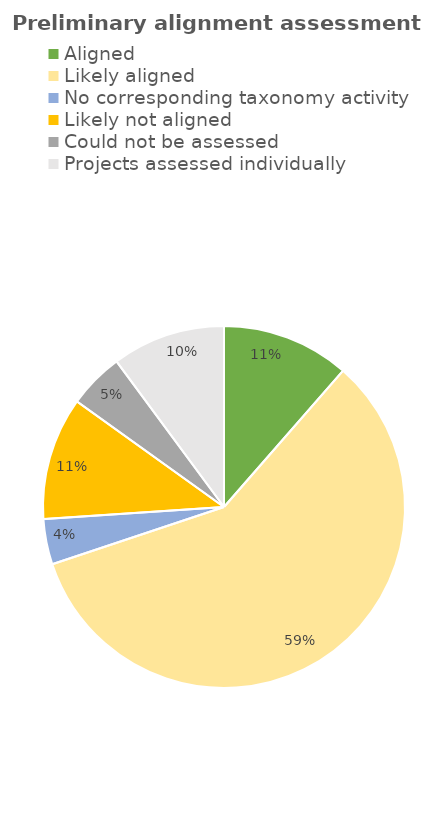
| Category | Series 0 |
|---|---|
| Aligned | 3757736 |
| Likely aligned | 19215898 |
| No corresponding taxonomy activity | 1334987 |
| Likely not aligned | 3606489 |
| Could not be assessed  | 1635532 |
| Projects assessed individually  | 3326215 |